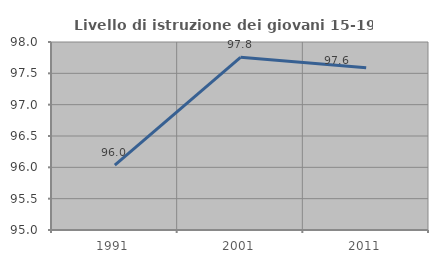
| Category | Livello di istruzione dei giovani 15-19 anni |
|---|---|
| 1991.0 | 96.036 |
| 2001.0 | 97.756 |
| 2011.0 | 97.59 |